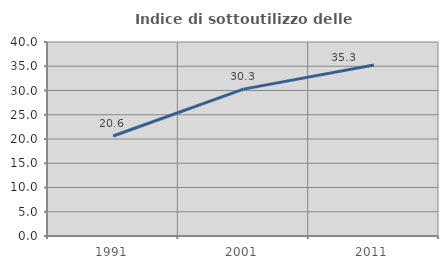
| Category | Indice di sottoutilizzo delle abitazioni  |
|---|---|
| 1991.0 | 20.613 |
| 2001.0 | 30.282 |
| 2011.0 | 35.268 |